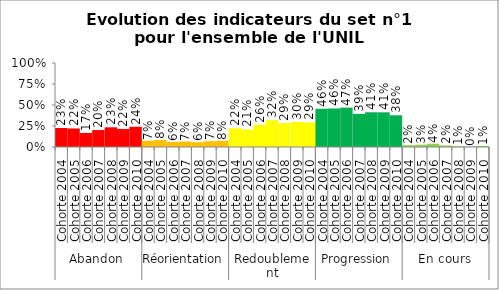
| Category | Ensemble UNIL |
|---|---|
| 0 | 0.226 |
| 1 | 0.221 |
| 2 | 0.168 |
| 3 | 0.202 |
| 4 | 0.234 |
| 5 | 0.215 |
| 6 | 0.241 |
| 7 | 0.075 |
| 8 | 0.084 |
| 9 | 0.06 |
| 10 | 0.065 |
| 11 | 0.057 |
| 12 | 0.069 |
| 13 | 0.076 |
| 14 | 0.222 |
| 15 | 0.209 |
| 16 | 0.264 |
| 17 | 0.319 |
| 18 | 0.285 |
| 19 | 0.299 |
| 20 | 0.293 |
| 21 | 0.455 |
| 22 | 0.459 |
| 23 | 0.469 |
| 24 | 0.395 |
| 25 | 0.413 |
| 26 | 0.413 |
| 27 | 0.377 |
| 28 | 0.022 |
| 29 | 0.028 |
| 30 | 0.039 |
| 31 | 0.019 |
| 32 | 0.01 |
| 33 | 0.004 |
| 34 | 0.013 |